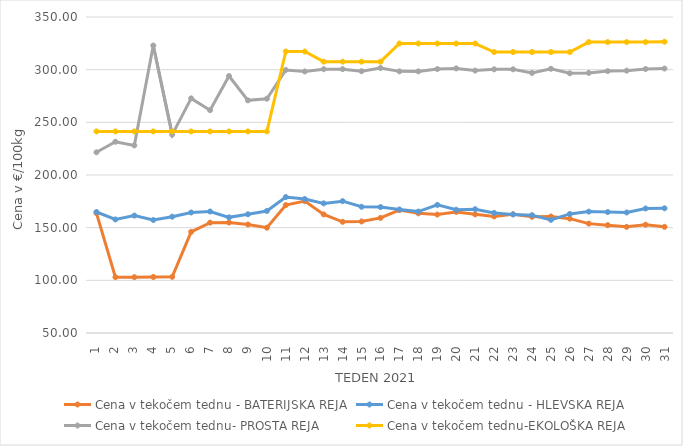
| Category | Cena v tekočem tednu - BATERIJSKA REJA | Cena v tekočem tednu - HLEVSKA REJA | Cena v tekočem tednu- PROSTA REJA | Cena v tekočem tednu-EKOLOŠKA REJA |
|---|---|---|---|---|
| 1.0 | 163.81 | 164.86 | 221.55 | 241.38 |
| 2.0 | 103.02 | 157.81 | 231.55 | 241.38 |
| 3.0 | 103.03 | 161.48 | 228.1 | 241.38 |
| 4.0 | 103.15 | 157.29 | 322.93 | 241.38 |
| 5.0 | 103.34 | 160.43 | 238.28 | 241.38 |
| 6.0 | 146.03 | 164.39 | 272.76 | 241.38 |
| 7.0 | 154.77 | 165.34 | 261.55 | 241.38 |
| 8.0 | 154.86 | 159.79 | 293.97 | 241.38 |
| 9.0 | 153 | 162.73 | 270.86 | 241.38 |
| 10.0 | 149.98 | 165.85 | 272.41 | 241.38 |
| 11.0 | 171.4 | 179.09 | 299.66 | 317.24 |
| 12.0 | 175.2 | 177.21 | 298.27 | 317.24 |
| 13.0 | 162.57 | 173.07 | 300.45 | 307.59 |
| 14.0 | 155.55 | 175.17 | 300.49 | 307.59 |
| 15.0 | 155.88 | 169.83 | 298.52 | 307.59 |
| 16.0 | 159.26 | 169.55 | 301.6 | 307.59 |
| 17.0 | 166.66 | 167.25 | 298.38 | 324.83 |
| 18.0 | 163.58 | 165.28 | 298.35 | 324.83 |
| 19.0 | 162.44 | 171.6 | 300.59 | 324.83 |
| 20.0 | 164.94 | 167.01 | 301.21 | 324.83 |
| 21.0 | 162.64 | 167.56 | 299.14 | 324.83 |
| 22.0 | 160.68 | 164.01 | 300.34 | 316.72 |
| 23.0 | 162.75 | 162.58 | 300.35 | 316.72 |
| 24.0 | 160.34 | 161.89 | 296.9 | 316.72 |
| 25.0 | 160.61 | 157.42 | 300.86 | 316.72 |
| 26.0 | 158.57 | 163.03 | 296.55 | 316.72 |
| 27.0 | 153.83 | 165.23 | 296.9 | 326.21 |
| 28.0 | 152.35 | 164.83 | 298.63 | 326.21 |
| 29.0 | 150.79 | 164.42 | 299.08 | 326.21 |
| 30.0 | 152.82 | 168.2 | 300.63 | 326.21 |
| 31.0 | 150.8 | 168.4 | 301.07 | 326.55 |